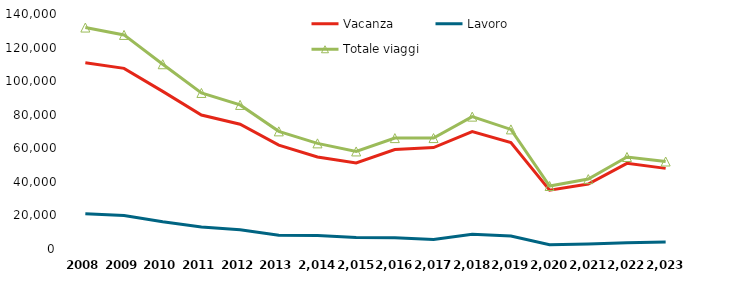
| Category | Vacanza | Lavoro | Totale viaggi |
|---|---|---|---|
| 2008 | 110901 | 21026 | 131928 |
| 2009 | 107603 | 19931 | 127533 |
| 2010 | 93894 | 16179 | 110073 |
| 2011 | 79811 | 13160 | 92971 |
| 2012 | 74301 | 11524 | 85825 |
| 2013 | 61916 | 8167 | 70083 |
| 2014 | 54816 | 8112 | 62927 |
| 2015 | 51222 | 6894 | 58115 |
| 2016 | 59298 | 6757 | 66055 |
| 2017 | 60455 | 5626 | 66081 |
| 2018 | 70004 | 8848 | 78853 |
| 2019 | 63467 | 7788 | 71254 |
| 2020 | 35024 | 2503 | 37527 |
| 2021 | 38685 | 2957 | 41642 |
| 2022 | 51040 | 3771 | 54811 |
| 2023 | 48028 | 4108 | 52136 |